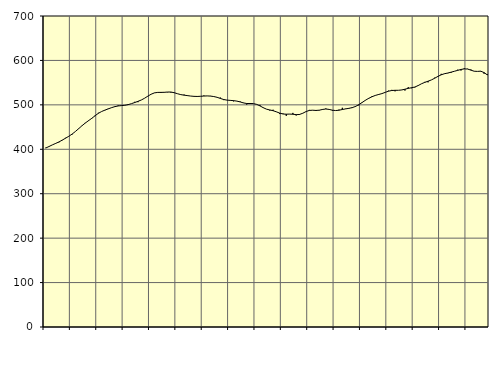
| Category | Piggar | Series 1 |
|---|---|---|
| nan | 403.5 | 402.73 |
| 87.0 | 405.9 | 406.19 |
| 87.0 | 409.8 | 409.79 |
| 87.0 | 413.7 | 413.06 |
| nan | 415.5 | 416.46 |
| 88.0 | 421 | 420.46 |
| 88.0 | 425.7 | 424.79 |
| 88.0 | 428.8 | 429.15 |
| nan | 433 | 434.12 |
| 89.0 | 439.9 | 439.92 |
| 89.0 | 445.8 | 446.35 |
| 89.0 | 452.6 | 452.87 |
| nan | 459.5 | 458.97 |
| 90.0 | 463.7 | 464.39 |
| 90.0 | 469.1 | 469.7 |
| 90.0 | 474.7 | 475.55 |
| nan | 482.1 | 480.97 |
| 91.0 | 485.1 | 485.08 |
| 91.0 | 487.8 | 488.24 |
| 91.0 | 491.6 | 490.96 |
| nan | 494 | 493.7 |
| 92.0 | 496.7 | 496.02 |
| 92.0 | 498.7 | 497.5 |
| 92.0 | 497.9 | 498.36 |
| nan | 499.4 | 499.01 |
| 93.0 | 501.4 | 500.41 |
| 93.0 | 502.6 | 502.66 |
| 93.0 | 506.8 | 505.19 |
| nan | 506 | 507.84 |
| 94.0 | 510.9 | 510.87 |
| 94.0 | 514.8 | 514.85 |
| 94.0 | 519.3 | 519.55 |
| nan | 523.8 | 523.92 |
| 95.0 | 527.2 | 526.95 |
| 95.0 | 528.5 | 528.04 |
| 95.0 | 527.2 | 528.06 |
| nan | 528.8 | 528.27 |
| 96.0 | 528.3 | 528.85 |
| 96.0 | 527.7 | 528.85 |
| 96.0 | 527.9 | 527.33 |
| nan | 524.9 | 525.05 |
| 97.0 | 522.8 | 523.05 |
| 97.0 | 523.1 | 521.8 |
| 97.0 | 520.1 | 520.84 |
| nan | 519.9 | 519.83 |
| 98.0 | 519.5 | 519.15 |
| 98.0 | 519.8 | 518.92 |
| 98.0 | 519.4 | 519.27 |
| nan | 521 | 519.86 |
| 99.0 | 520.1 | 520.12 |
| 99.0 | 520.1 | 519.74 |
| 99.0 | 518.5 | 518.73 |
| nan | 516.9 | 517.05 |
| 0.0 | 516.4 | 514.48 |
| 0.0 | 510.7 | 512.05 |
| 0.0 | 510.7 | 510.68 |
| nan | 509.5 | 510.07 |
| 1.0 | 507.9 | 509.49 |
| 1.0 | 508.3 | 508.45 |
| 1.0 | 507.6 | 506.61 |
| nan | 504.8 | 504.36 |
| 2.0 | 500.7 | 503.05 |
| 2.0 | 504.1 | 503.01 |
| 2.0 | 503 | 502.9 |
| nan | 501.4 | 501.14 |
| 3.0 | 499.9 | 497.73 |
| 3.0 | 493.1 | 493.64 |
| 3.0 | 490.2 | 490.32 |
| nan | 487.3 | 488.51 |
| 4.0 | 489 | 486.86 |
| 4.0 | 484.5 | 484.3 |
| 4.0 | 479.3 | 481.47 |
| nan | 480.4 | 479.39 |
| 5.0 | 475.2 | 478.99 |
| 5.0 | 479.1 | 479.24 |
| 5.0 | 481.9 | 478.86 |
| nan | 476 | 478.02 |
| 6.0 | 477.3 | 478.34 |
| 6.0 | 481.4 | 481.08 |
| 6.0 | 484.8 | 484.92 |
| nan | 488.6 | 487.45 |
| 7.0 | 488.1 | 487.93 |
| 7.0 | 486.2 | 487.42 |
| 7.0 | 487.4 | 487.97 |
| nan | 490.4 | 489.67 |
| 8.0 | 491.8 | 490.65 |
| 8.0 | 489.7 | 489.75 |
| 8.0 | 486.7 | 487.96 |
| nan | 487.2 | 487.19 |
| 9.0 | 489.3 | 487.94 |
| 9.0 | 493.4 | 489.54 |
| 9.0 | 491.4 | 490.95 |
| nan | 491.5 | 492.17 |
| 10.0 | 492.8 | 493.78 |
| 10.0 | 497.4 | 496.39 |
| 10.0 | 498.8 | 500.36 |
| nan | 505.9 | 505.27 |
| 11.0 | 509.9 | 510.27 |
| 11.0 | 513.7 | 514.67 |
| 11.0 | 519.4 | 518.27 |
| nan | 520.9 | 521.17 |
| 12.0 | 524.1 | 523.28 |
| 12.0 | 525.6 | 525.31 |
| 12.0 | 527.9 | 528.09 |
| nan | 531.9 | 530.78 |
| 13.0 | 533.7 | 532.31 |
| 13.0 | 530.5 | 532.76 |
| 13.0 | 532.8 | 532.8 |
| nan | 533.7 | 533.51 |
| 14.0 | 532.2 | 535.23 |
| 14.0 | 539.8 | 537.11 |
| 14.0 | 537.5 | 538.51 |
| nan | 539.2 | 540.14 |
| 15.0 | 544 | 543.37 |
| 15.0 | 547.3 | 547.42 |
| 15.0 | 551.7 | 550.54 |
| nan | 550.7 | 553.19 |
| 16.0 | 556 | 556.04 |
| 16.0 | 561.1 | 559.85 |
| 16.0 | 564.8 | 564.05 |
| nan | 569.8 | 567.63 |
| 17.0 | 569.7 | 570.11 |
| 17.0 | 571.2 | 571.66 |
| 17.0 | 572.2 | 573.56 |
| nan | 575.5 | 575.6 |
| 18.0 | 579.1 | 577.63 |
| 18.0 | 577.3 | 579.65 |
| 18.0 | 582.3 | 580.99 |
| nan | 581.1 | 580.62 |
| 19.0 | 579.6 | 578.17 |
| 19.0 | 575.6 | 575.7 |
| 19.0 | 575.2 | 575.3 |
| nan | 575.2 | 575.79 |
| 20.0 | 570.1 | 572.62 |
| 20.0 | 569.2 | 567.39 |